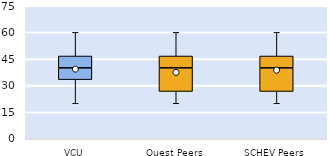
| Category | 25th | 50th | 75th |
|---|---|---|---|
| VCU | 33.333 | 6.667 | 6.667 |
| Quest Peers | 26.667 | 13.333 | 6.667 |
| SCHEV Peers | 26.667 | 13.333 | 6.667 |